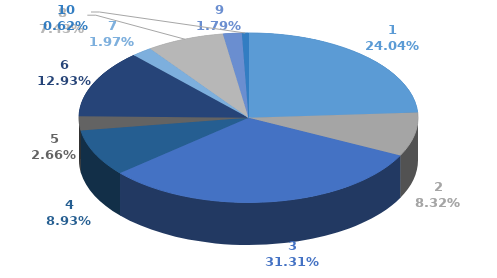
| Category | Series 0 |
|---|---|
| 0 | 385369 |
| 1 | 133378 |
| 2 | 501901 |
| 3 | 143087 |
| 4 | 42616 |
| 5 | 207294 |
| 6 | 31548 |
| 7 | 119048 |
| 8 | 28680 |
| 9 | 10000 |